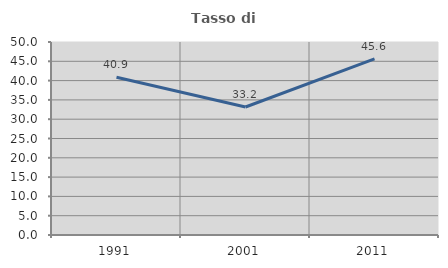
| Category | Tasso di occupazione   |
|---|---|
| 1991.0 | 40.86 |
| 2001.0 | 33.155 |
| 2011.0 | 45.641 |